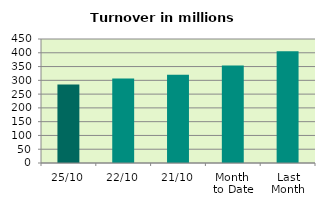
| Category | Series 0 |
|---|---|
| 25/10 | 284.929 |
| 22/10 | 306.401 |
| 21/10 | 320.043 |
| Month 
to Date | 354.053 |
| Last
Month | 405.806 |